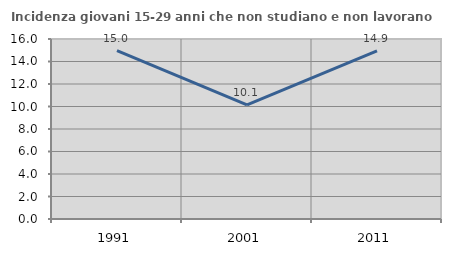
| Category | Incidenza giovani 15-29 anni che non studiano e non lavorano  |
|---|---|
| 1991.0 | 14.974 |
| 2001.0 | 10.135 |
| 2011.0 | 14.943 |